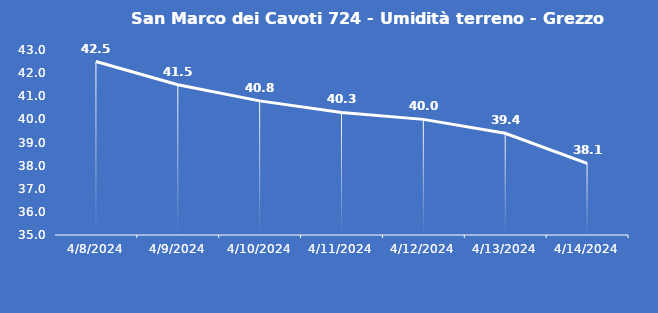
| Category | San Marco dei Cavoti 724 - Umidità terreno - Grezzo (%VWC) |
|---|---|
| 4/8/24 | 42.5 |
| 4/9/24 | 41.5 |
| 4/10/24 | 40.8 |
| 4/11/24 | 40.3 |
| 4/12/24 | 40 |
| 4/13/24 | 39.4 |
| 4/14/24 | 38.1 |